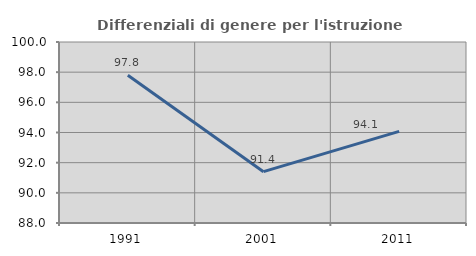
| Category | Differenziali di genere per l'istruzione superiore |
|---|---|
| 1991.0 | 97.799 |
| 2001.0 | 91.403 |
| 2011.0 | 94.072 |